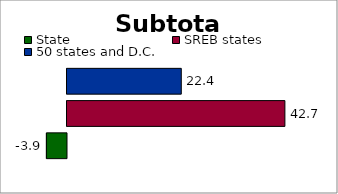
| Category | State | SREB states | 50 states and D.C. |
|---|---|---|---|
| 0 | -3.941 | 42.724 | 22.411 |